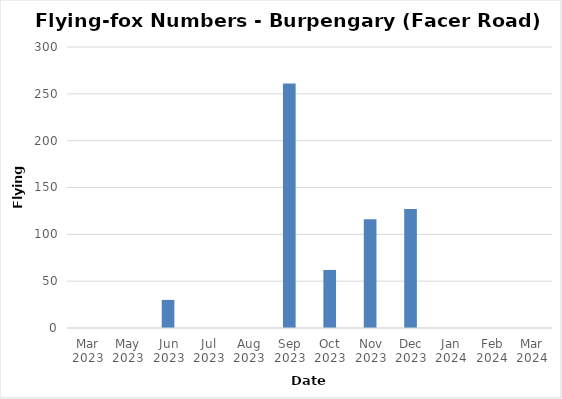
| Category | Flying-foxes |
|---|---|
| Mar 2023 | 0 |
| May 2023 | 0 |
| Jun 2023 | 30 |
| Jul 2023 | 0 |
| Aug 2023 | 0 |
| Sep 2023 | 261 |
| Oct 2023 | 62 |
| Nov 2023 | 116 |
| Dec 2023 | 127 |
| Jan 2024 | 0 |
| Feb 2024 | 0 |
| Mar 2024 | 0 |